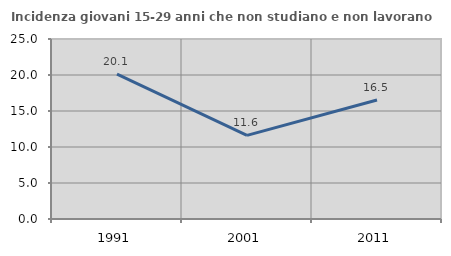
| Category | Incidenza giovani 15-29 anni che non studiano e non lavorano  |
|---|---|
| 1991.0 | 20.135 |
| 2001.0 | 11.613 |
| 2011.0 | 16.529 |